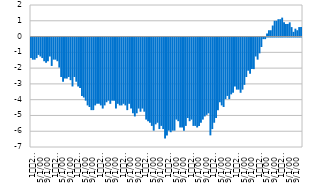
| Category |  Фискални резултат |
|---|---|
| 1
2007. | -1.3 |
| 2 | -1.4 |
| 3 | -1.4 |
| 4 | -1.3 |
| 5 | -1.1 |
| 6 | -1.2 |
| 7 | -1.3 |
| 8 | -1.5 |
| 9 | -1.6 |
| 10 | -1.5 |
| 11 | -1.2 |
| 12 | -1.8 |
| 1
2008. | -1.4 |
| 2 | -1.4 |
| 3 | -1.5 |
| 4 | -1.9 |
| 5 | -2.5 |
| 6 | -2.8 |
| 7 | -2.6 |
| 8 | -2.6 |
| 9 | -2.5 |
| 10 | -2.7 |
| 11 | -3.1 |
| 12 | -2.5 |
| 1
2009. | -2.8 |
| 2 | -3.1 |
| 3 | -3.2 |
| 4 | -3.7 |
| 5 | -3.8 |
| 6 | -4 |
| 7 | -4.3 |
| 8 | -4.4 |
| 9 | -4.6 |
| 10 | -4.6 |
| 11 | -4.3 |
| 12 | -4.2 |
| 1
2010. | -4.2 |
| 2 | -4.3 |
| 3 | -4.5 |
| 4 | -4.3 |
| 5 | -4.1 |
| 6 | -4 |
| 7 | -4.2 |
| 8 | -4 |
| 9 | -4 |
| 10 | -4.5 |
| 11 | -4.2 |
| 12 | -4.3 |
| 1
2011. | -4.3 |
| 2 | -4.2 |
| 3 | -4.3 |
| 4 | -4.6 |
| 5 | -4.2 |
| 6 | -4.5 |
| 7 | -4.8 |
| 8 | -5 |
| 9 | -4.8 |
| 10 | -4.5 |
| 11 | -4.7 |
| 12 | -4.5 |
| 1
2012. | -4.7 |
| 2 | -5.2 |
| 3 | -5.3 |
| 4 | -5.4 |
| 5 | -5.6 |
| 6 | -5.9 |
| 7 | -5.5 |
| 8 | -5.4 |
| 9 | -5.8 |
| 10 | -5.6 |
| 11 | -5.8 |
| 12 | -6.4 |
| 1
2013. | -6.2 |
| 2 | -5.9 |
| 3 | -6 |
| 4 | -5.9 |
| 5 | -5.9 |
| 6 | -5.2 |
| 7 | -5.3 |
| 8 | -5.7 |
| 9 | -5.7 |
| 10 | -5.9 |
| 11 | -5.6 |
| 12 | -5.1 |
| 1
2014. | -5.3 |
| 2 | -5.2 |
| 3 | -5.6 |
| 4 | -5.6 |
| 5 | -5.7 |
| 6 | -5.6 |
| 7 | -5.4 |
| 8 | -5.2 |
| 9 | -5 |
| 10 | -4.9 |
| 11 | -4.8 |
| 12 | -6.2 |
| 1
2015. | -5.8 |
| 2 | -5.4 |
| 3 | -5.1 |
| 4 | -4.6 |
| 5 | -4.1 |
| 6 | -4.3 |
| 7 | -4.4 |
| 8 | -3.9 |
| 9 | -3.7 |
| 10 | -3.9 |
| 11 | -3.6 |
| 12 | -3.5 |
| 1
2016. | -3.1 |
| 2 | -3.3 |
| 3 | -3.3 |
| 4 | -3.5 |
| 5 | -3.3 |
| 6 | -3 |
| 7 | -2.5 |
| 8 | -2.1 |
| 9 | -2.3 |
| 10 | -2 |
| 11 | -2 |
| 12 | -1.2 |
| 1
2017. | -1.4 |
| 2 | -1 |
| 3 | -0.6 |
| 4 | -0.1 |
| 5 | -0.1 |
| 6 | 0.2 |
| 7 | 0.4 |
| 8 | 0.4 |
| 9 | 0.7 |
| 10 | 1 |
| 11 | 1 |
| 12 | 1.1 |
| 1
2018. | 1.1 |
| 2 | 1.2 |
| 3 | 0.9 |
| 4 | 0.8 |
| 5 | 0.8 |
| 6 | 0.9 |
| 7 | 0.6 |
| 8 | 0.3 |
| 9 | 0.5 |
| 10 | 0.4 |
| 11 | 0.6 |
| 12 | 0.6 |